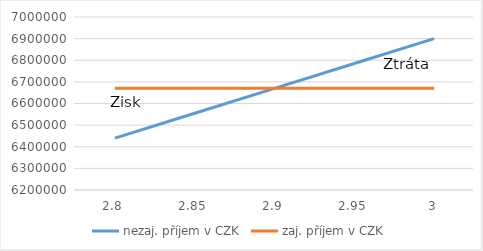
| Category | nezaj. příjem v CZK | zaj. příjem v CZK |
|---|---|---|
| 2.8 | 6440000 | 6670000 |
| 2.85 | 6555000 | 6670000 |
| 2.9 | 6670000 | 6670000 |
| 2.95 | 6785000 | 6670000 |
| 3.0 | 6900000 | 6670000 |